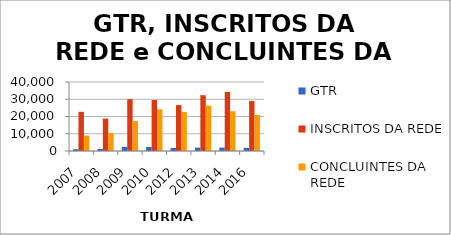
| Category | GTR | INSCRITOS DA REDE | CONCLUINTES DA REDE |
|---|---|---|---|
| 2007 | 1051 | 22706 | 8915 |
| 2008 | 1200 | 18783 | 10367 |
| 2009 | 2401 | 30056 | 17377 |
| 2010 | 2354 | 29554 | 24123 |
| 2012 | 1773 | 26611 | 22688 |
| 2013 | 1953 | 32346 | 26258 |
| 2014 | 1951 | 34286 | 23049 |
| 2016 | 1825 | 28965 | 20883 |